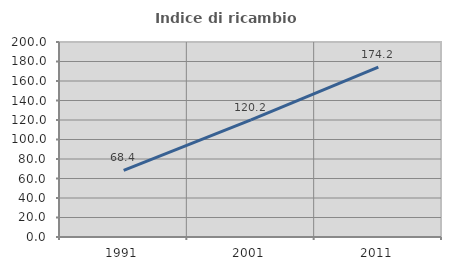
| Category | Indice di ricambio occupazionale  |
|---|---|
| 1991.0 | 68.38 |
| 2001.0 | 120.173 |
| 2011.0 | 174.242 |